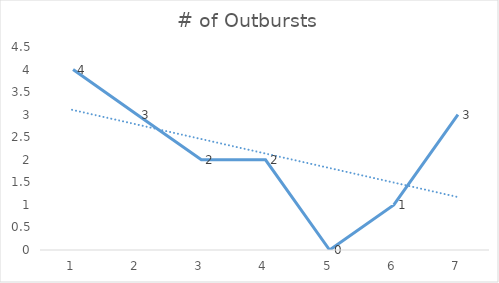
| Category | # of Outbursts |
|---|---|
| 0 | 4 |
| 1 | 3 |
| 2 | 2 |
| 3 | 2 |
| 4 | 0 |
| 5 | 1 |
| 6 | 3 |